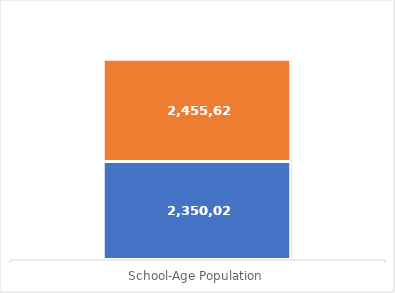
| Category | Female | Male |
|---|---|---|
| School-Age Population | 2350020 | 2455626 |